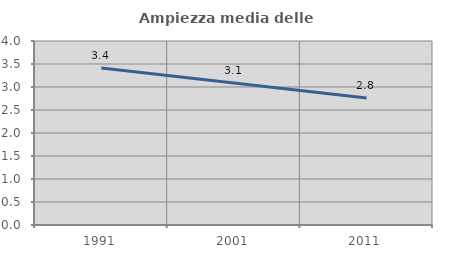
| Category | Ampiezza media delle famiglie |
|---|---|
| 1991.0 | 3.411 |
| 2001.0 | 3.085 |
| 2011.0 | 2.761 |